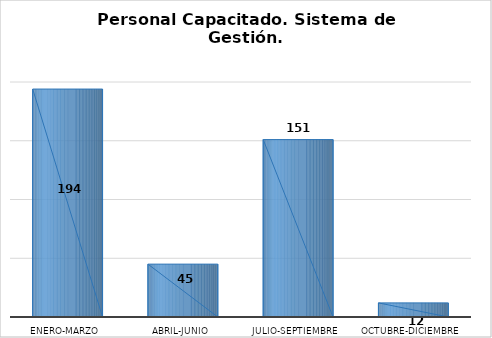
| Category | Personal capacitado |
|---|---|
| Enero-Marzo | 194 |
| Abril-Junio | 45 |
| Julio-Septiembre | 151 |
| Octubre-Diciembre | 12 |